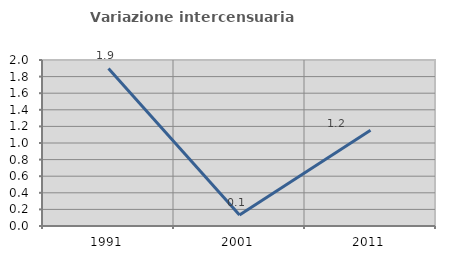
| Category | Variazione intercensuaria annua |
|---|---|
| 1991.0 | 1.899 |
| 2001.0 | 0.134 |
| 2011.0 | 1.154 |